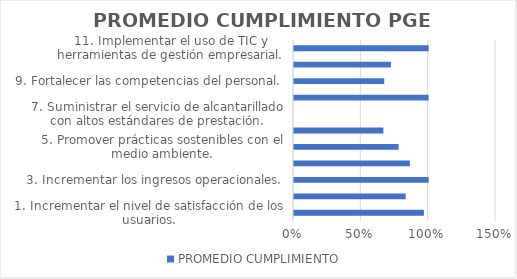
| Category | PROMEDIO CUMPLIMIENTO  |
|---|---|
| 1. Incrementar el nivel de satisfacción de los usuarios. | 0.964 |
| 2. Posicionar la gestión empresarial con prácticas de transparencia. | 0.829 |
| 3. Incrementar los ingresos operacionales. | 1 |
| 4. Lograr eficiencia en la gestión empresarial. | 0.86 |
| 5. Promover prácticas sostenibles con el medio ambiente. | 0.777 |
| 6. SuminIstrar el servicio de acueducto con altos estándares de prestación. | 0.664 |
| 7. Suministrar el servicio de alcantarillado con altos estándares de prestación. | 0 |
| 8. Suministrar el servicio de aseo con altos estándares de prestación. | 1 |
| 9. Fortalecer las competencias del personal. | 0.67 |
| 10. Mejorar el clima y la cultura organizacional. | 0.72 |
| 11. Implementar el uso de TIC y herramientas de gestión empresarial. | 1 |